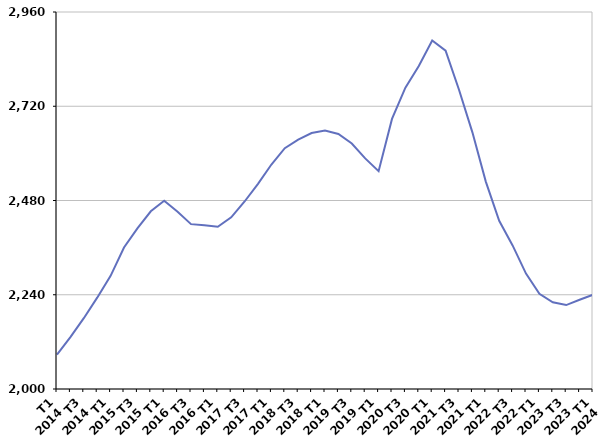
| Category | Inscrits depuis plus d'un an |
|---|---|
| T1
2014 | 2087.3 |
| T2
2014 | 2132.1 |
| T3
2014 | 2180.3 |
| T4
2014 | 2232.6 |
| T1
2015 | 2288.2 |
| T2
2015 | 2360.3 |
| T3
2015 | 2409.2 |
| T4
2015 | 2452.5 |
| T1
2016 | 2479.3 |
| T2
2016 | 2451.1 |
| T3
2016 | 2419.8 |
| T4
2016 | 2417.2 |
| T1
2017 | 2413.2 |
| T2
2017 | 2437.1 |
| T3
2017 | 2477.5 |
| T4
2017 | 2522.5 |
| T1
2018 | 2571.6 |
| T2
2018 | 2613.1 |
| T3
2018 | 2635.2 |
| T4
2018 | 2651.9 |
| T1
2019 | 2658.3 |
| T2
2019 | 2649.5 |
| T3
2019 | 2625 |
| T4
2019 | 2587.2 |
| T1
2020 | 2554.6 |
| T2
2020 | 2687.7 |
| T3
2020 | 2767.4 |
| T4
2020 | 2822.7 |
| T1
2021 | 2887.5 |
| T2
2021 | 2861.7 |
| T3
2021 | 2761.9 |
| T4
2021 | 2653.6 |
| T1
2022 | 2528.1 |
| T2
2022 | 2428.3 |
| T3
2022 | 2365.6 |
| T4
2022 | 2293.9 |
| T1
2023 | 2242.3 |
| T2
2023 | 2220.7 |
| T3
2023 | 2213.7 |
| T4
2023 | 2227.3 |
| T1
2024 | 2240.1 |